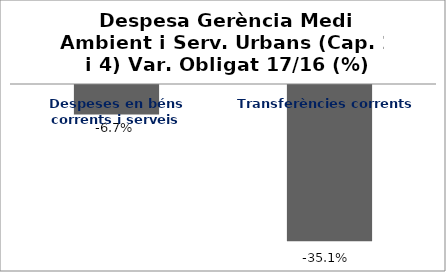
| Category | Series 0 |
|---|---|
| Despeses en béns corrents i serveis | -0.067 |
| Transferències corrents | -0.351 |